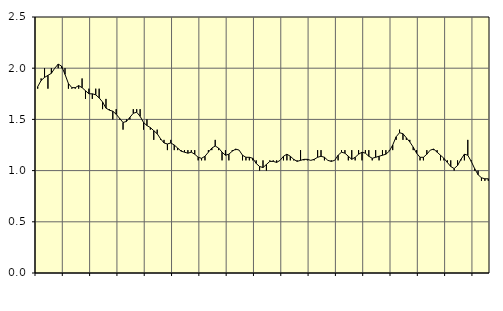
| Category | Piggar | Jordbruk, skogsbruk o fiske, SNI 01-03 |
|---|---|---|
| nan | 1.8 | 1.82 |
| 87.0 | 1.9 | 1.88 |
| 87.0 | 2 | 1.91 |
| 87.0 | 1.8 | 1.93 |
| nan | 2 | 1.95 |
| 88.0 | 2 | 2 |
| 88.0 | 2 | 2.04 |
| 88.0 | 2 | 2.02 |
| nan | 2 | 1.94 |
| 89.0 | 1.8 | 1.85 |
| 89.0 | 1.8 | 1.81 |
| 89.0 | 1.8 | 1.81 |
| nan | 1.8 | 1.83 |
| 90.0 | 1.9 | 1.81 |
| 90.0 | 1.7 | 1.78 |
| 90.0 | 1.8 | 1.75 |
| nan | 1.7 | 1.75 |
| 91.0 | 1.8 | 1.74 |
| 91.0 | 1.8 | 1.71 |
| 91.0 | 1.6 | 1.67 |
| nan | 1.7 | 1.61 |
| 92.0 | 1.6 | 1.59 |
| 92.0 | 1.5 | 1.58 |
| 92.0 | 1.6 | 1.55 |
| nan | 1.5 | 1.51 |
| 93.0 | 1.4 | 1.47 |
| 93.0 | 1.5 | 1.48 |
| 93.0 | 1.5 | 1.52 |
| nan | 1.6 | 1.56 |
| 94.0 | 1.6 | 1.57 |
| 94.0 | 1.6 | 1.53 |
| 94.0 | 1.4 | 1.47 |
| nan | 1.5 | 1.44 |
| 95.0 | 1.4 | 1.42 |
| 95.0 | 1.3 | 1.39 |
| 95.0 | 1.4 | 1.36 |
| nan | 1.3 | 1.31 |
| 96.0 | 1.3 | 1.27 |
| 96.0 | 1.2 | 1.26 |
| 96.0 | 1.3 | 1.27 |
| nan | 1.2 | 1.25 |
| 97.0 | 1.2 | 1.22 |
| 97.0 | 1.2 | 1.19 |
| 97.0 | 1.2 | 1.18 |
| nan | 1.2 | 1.17 |
| 98.0 | 1.2 | 1.18 |
| 98.0 | 1.2 | 1.16 |
| 98.0 | 1.1 | 1.13 |
| nan | 1.1 | 1.12 |
| 99.0 | 1.1 | 1.14 |
| 99.0 | 1.2 | 1.18 |
| 99.0 | 1.2 | 1.22 |
| nan | 1.3 | 1.24 |
| 0.0 | 1.2 | 1.22 |
| 0.0 | 1.1 | 1.18 |
| 0.0 | 1.2 | 1.15 |
| nan | 1.1 | 1.16 |
| 1.0 | 1.2 | 1.19 |
| 1.0 | 1.2 | 1.21 |
| 1.0 | 1.2 | 1.2 |
| nan | 1.1 | 1.15 |
| 2.0 | 1.1 | 1.13 |
| 2.0 | 1.1 | 1.13 |
| 2.0 | 1.1 | 1.12 |
| nan | 1.1 | 1.07 |
| 3.0 | 1 | 1.04 |
| 3.0 | 1.1 | 1.03 |
| 3.0 | 1 | 1.06 |
| nan | 1.1 | 1.09 |
| 4.0 | 1.1 | 1.09 |
| 4.0 | 1.1 | 1.08 |
| 4.0 | 1.1 | 1.1 |
| nan | 1.1 | 1.14 |
| 5.0 | 1.1 | 1.16 |
| 5.0 | 1.1 | 1.14 |
| 5.0 | 1.1 | 1.11 |
| nan | 1.1 | 1.09 |
| 6.0 | 1.2 | 1.1 |
| 6.0 | 1.1 | 1.11 |
| 6.0 | 1.1 | 1.11 |
| nan | 1.1 | 1.1 |
| 7.0 | 1.1 | 1.11 |
| 7.0 | 1.2 | 1.13 |
| 7.0 | 1.2 | 1.14 |
| nan | 1.1 | 1.13 |
| 8.0 | 1.1 | 1.1 |
| 8.0 | 1.1 | 1.09 |
| 8.0 | 1.1 | 1.1 |
| nan | 1.1 | 1.15 |
| 9.0 | 1.2 | 1.18 |
| 9.0 | 1.2 | 1.17 |
| 9.0 | 1.1 | 1.14 |
| nan | 1.2 | 1.11 |
| 10.0 | 1.1 | 1.13 |
| 10.0 | 1.2 | 1.16 |
| 10.0 | 1.1 | 1.18 |
| nan | 1.2 | 1.17 |
| 11.0 | 1.2 | 1.14 |
| 11.0 | 1.1 | 1.12 |
| 11.0 | 1.2 | 1.13 |
| nan | 1.1 | 1.14 |
| 12.0 | 1.2 | 1.15 |
| 12.0 | 1.2 | 1.16 |
| 12.0 | 1.2 | 1.19 |
| nan | 1.2 | 1.25 |
| 13.0 | 1.3 | 1.33 |
| 13.0 | 1.4 | 1.37 |
| 13.0 | 1.3 | 1.36 |
| nan | 1.3 | 1.32 |
| 14.0 | 1.3 | 1.28 |
| 14.0 | 1.2 | 1.23 |
| 14.0 | 1.2 | 1.17 |
| nan | 1.1 | 1.13 |
| 15.0 | 1.1 | 1.13 |
| 15.0 | 1.2 | 1.16 |
| 15.0 | 1.2 | 1.2 |
| nan | 1.2 | 1.21 |
| 16.0 | 1.2 | 1.18 |
| 16.0 | 1.1 | 1.15 |
| 16.0 | 1.1 | 1.12 |
| nan | 1.1 | 1.08 |
| 17.0 | 1.1 | 1.04 |
| 17.0 | 1 | 1.02 |
| 17.0 | 1.1 | 1.05 |
| nan | 1.1 | 1.11 |
| 18.0 | 1.1 | 1.16 |
| 18.0 | 1.3 | 1.15 |
| 18.0 | 1.1 | 1.09 |
| nan | 1 | 1.02 |
| 19.0 | 1 | 0.96 |
| 19.0 | 0.9 | 0.93 |
| 19.0 | 0.9 | 0.92 |
| nan | 0.9 | 0.92 |